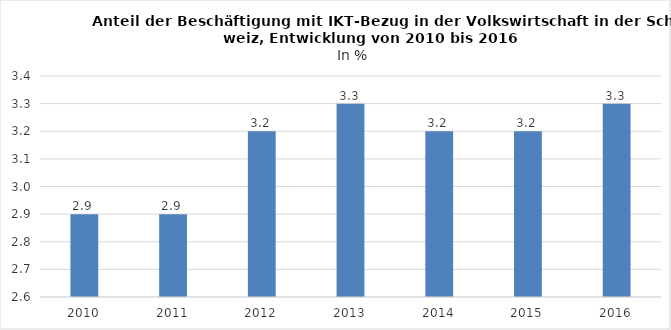
| Category | In % |
|---|---|
| 2010.0 | 2.9 |
| 2011.0 | 2.9 |
| 2012.0 | 3.2 |
| 2013.0 | 3.3 |
| 2014.0 | 3.2 |
| 2015.0 | 3.2 |
| 2016.0 | 3.3 |